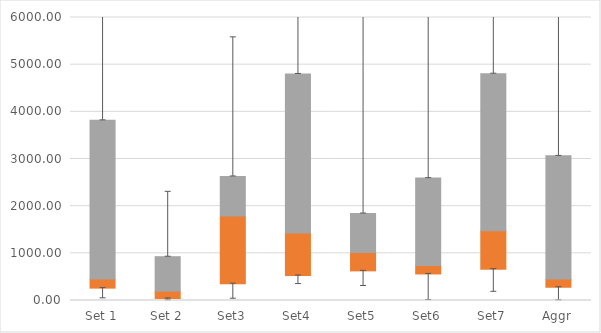
| Category | Q1 | Median-Q1 | Q3-Median |
|---|---|---|---|
| Set 1 | 262.42 | 191.104 | 3366.661 |
| Set 2 | 42.812 | 155.188 | 730.897 |
| Set3 | 356.171 | 1433.594 | 841.4 |
| Set4 | 528.19 | 901.787 | 3373.967 |
| Set5 | 628.073 | 388.045 | 828.908 |
| Set6 | 562.699 | 179.252 | 1852.605 |
| Set7 | 663.702 | 814.572 | 3330.894 |
| Aggr | 280.866 | 172.657 | 2613.06 |